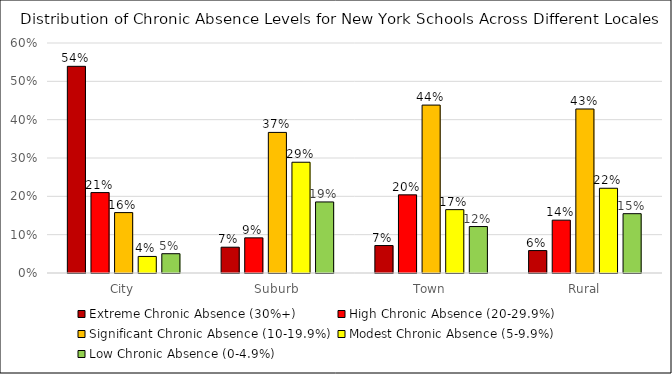
| Category | Extreme Chronic Absence (30%+) | High Chronic Absence (20-29.9%) | Significant Chronic Absence (10-19.9%) | Modest Chronic Absence (5-9.9%) | Low Chronic Absence (0-4.9%) |
|---|---|---|---|---|---|
| City | 0.539 | 0.21 | 0.158 | 0.043 | 0.05 |
| Suburb | 0.067 | 0.092 | 0.367 | 0.289 | 0.185 |
| Town | 0.072 | 0.204 | 0.438 | 0.165 | 0.121 |
| Rural | 0.059 | 0.138 | 0.428 | 0.221 | 0.155 |